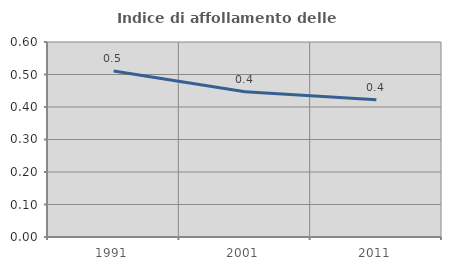
| Category | Indice di affollamento delle abitazioni  |
|---|---|
| 1991.0 | 0.511 |
| 2001.0 | 0.447 |
| 2011.0 | 0.422 |